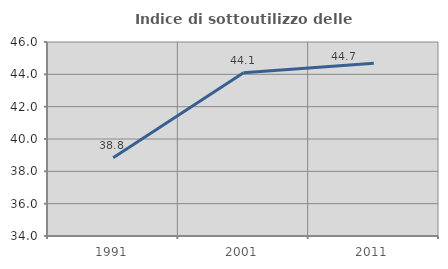
| Category | Indice di sottoutilizzo delle abitazioni  |
|---|---|
| 1991.0 | 38.847 |
| 2001.0 | 44.096 |
| 2011.0 | 44.691 |